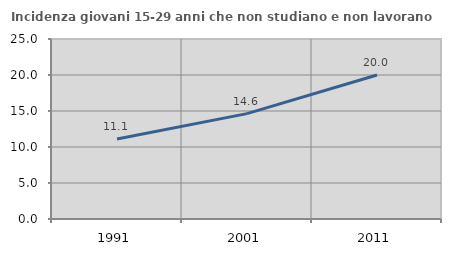
| Category | Incidenza giovani 15-29 anni che non studiano e non lavorano  |
|---|---|
| 1991.0 | 11.111 |
| 2001.0 | 14.634 |
| 2011.0 | 20 |